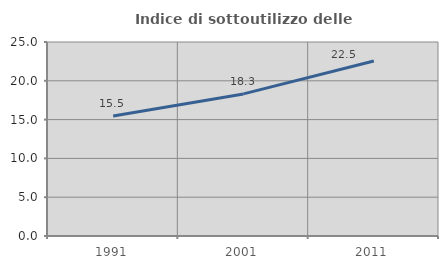
| Category | Indice di sottoutilizzo delle abitazioni  |
|---|---|
| 1991.0 | 15.461 |
| 2001.0 | 18.31 |
| 2011.0 | 22.547 |